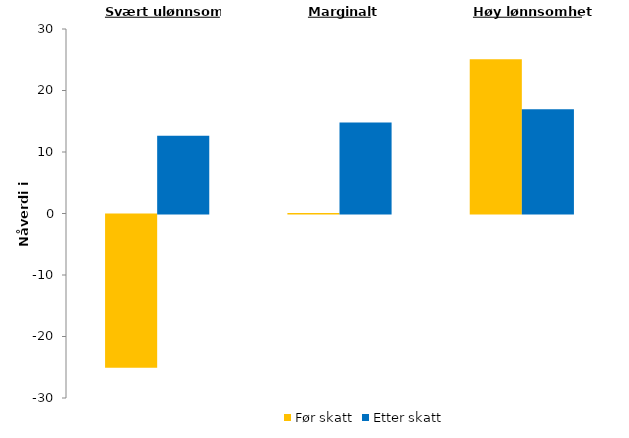
| Category | Før skatt | Etter skatt |
|---|---|---|
| Svært ulønnsomt | -24.903 | 12.64 |
| Marginalt | 0.097 | 14.797 |
| Høy lønnsomhet | 25.097 | 16.953 |